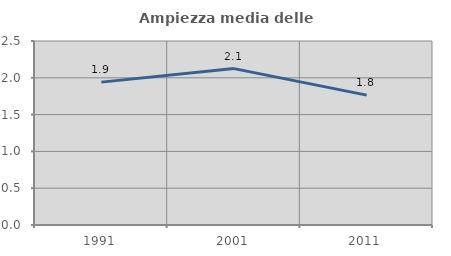
| Category | Ampiezza media delle famiglie |
|---|---|
| 1991.0 | 1.941 |
| 2001.0 | 2.125 |
| 2011.0 | 1.765 |